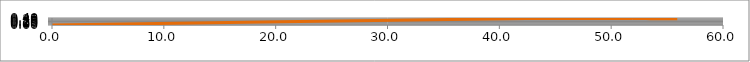
| Category | Series 0 |
|---|---|
| 0.0 | 0 |
| 40.7975 | 0.362 |
| 41.5937 | 0.366 |
| 42.3894 | 0.368 |
| 43.1847 | 0.37 |
| 43.98 | 0.371 |
| 44.7752 | 0.371 |
| 45.5704 | 0.372 |
| 46.3656 | 0.372 |
| 47.1608 | 0.372 |
| 47.9561 | 0.372 |
| 48.7514 | 0.372 |
| 49.5466 | 0.371 |
| 50.3419 | 0.37 |
| 51.1372 | 0.369 |
| 51.9325 | 0.368 |
| 52.7278 | 0.366 |
| 53.5231 | 0.363 |
| 54.3184 | 0.361 |
| 55.1137 | 0.358 |
| 55.909 | 0.355 |